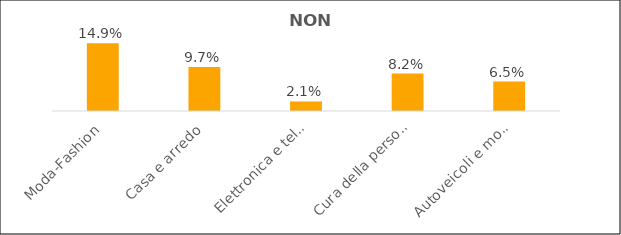
| Category | Series 0 |
|---|---|
| Moda-Fashion | 0.149 |
| Casa e arredo | 0.097 |
| Elettronica e telecomunicazioni | 0.021 |
| Cura della persona, sport e tempo libero | 0.082 |
| Autoveicoli e motocicli | 0.065 |